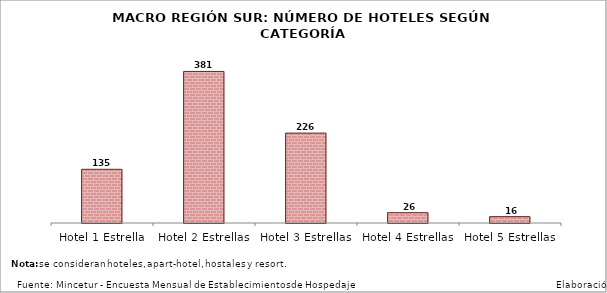
| Category | Series 0 |
|---|---|
| Hotel 1 Estrella | 135 |
| Hotel 2 Estrellas | 381 |
| Hotel 3 Estrellas | 226 |
| Hotel 4 Estrellas | 26 |
| Hotel 5 Estrellas | 16 |